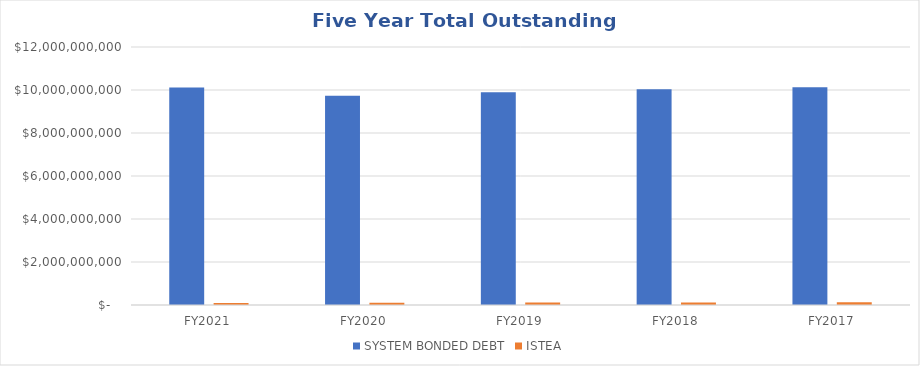
| Category | SYSTEM BONDED DEBT | ISTEA |
|---|---|---|
| FY2021 | 10116437384 | 91289967 |
| FY2020 | 9727863864 | 102315128 |
| FY2019 | 9897258875 | 112895896 |
| FY2018 | 10036671622 | 120101628 |
| FY2017 | 10123709102 | 125337455 |